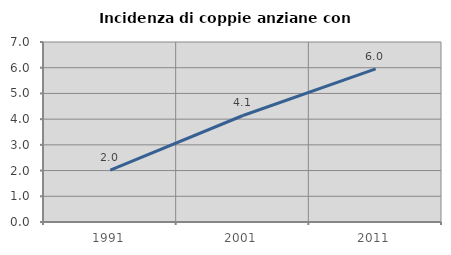
| Category | Incidenza di coppie anziane con figli |
|---|---|
| 1991.0 | 2.013 |
| 2001.0 | 4.142 |
| 2011.0 | 5.952 |